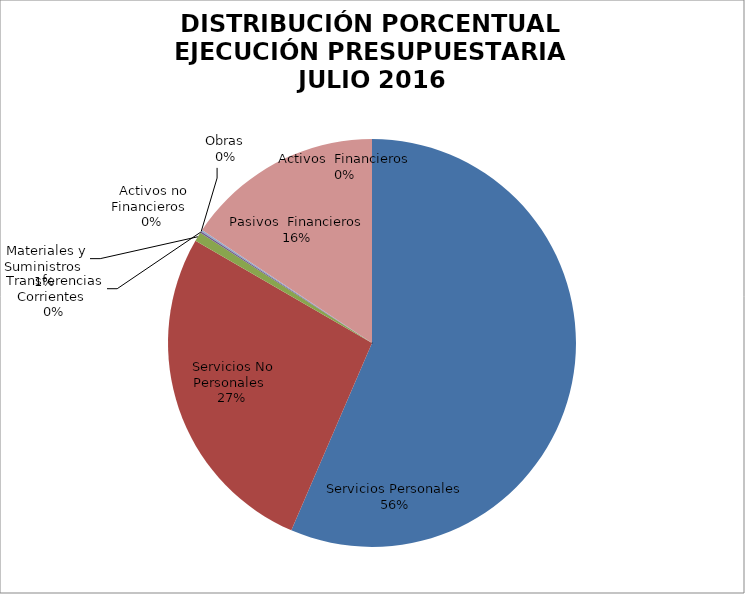
| Category | Series 0 | Series 1 |
|---|---|---|
| Servicios Personales | 11280188.32 | 0.822 |
| Servicios No Personales | 5370100.4 | 0.391 |
| Materiales y Suministros | 145515.57 | 0.011 |
| Transferencias Corrientes | 26392.67 | 0 |
| Activos no Financieros | 0 | 0 |
| Obras | 0 | 0 |
| Activos  Financieros | 24000 | 0.002 |
| Pasivos  Financieros | -3129266.43 | -0.228 |